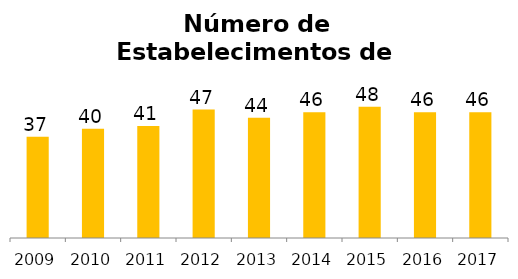
| Category | Aluguel de Transporte |
|---|---|
| 2009.0 | 37 |
| 2010.0 | 40 |
| 2011.0 | 41 |
| 2012.0 | 47 |
| 2013.0 | 44 |
| 2014.0 | 46 |
| 2015.0 | 48 |
| 2016.0 | 46 |
| 2017.0 | 46 |